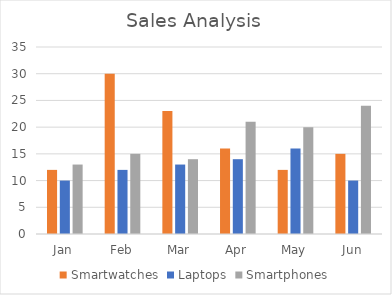
| Category | Smartwatches | Laptops | Smartphones |
|---|---|---|---|
| Jan | 12 | 10 | 13 |
| Feb | 30 | 12 | 15 |
| Mar | 23 | 13 | 14 |
| Apr | 16 | 14 | 21 |
| May | 12 | 16 | 20 |
| Jun | 15 | 10 | 24 |